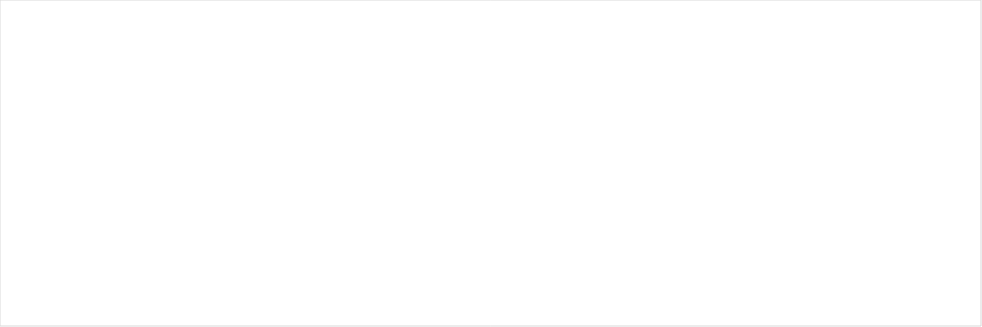
| Category | Total |
|---|---|
| January | 21 |
| February | 8 |
| March | 7 |
| April | 9 |
| May | 27 |
| June | 10 |
| July | 17 |
| August | 13 |
| September | 13 |
| October | 13 |
| November | 12 |
| December | 7 |